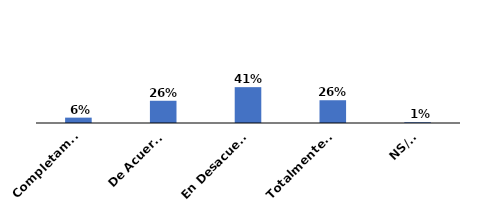
| Category | Series 0 |
|---|---|
| Completamente de acuerdo | 0.062 |
| De Acuerdo | 0.256 |
| En Desacuerdo | 0.412 |
| Totalmente en desacuerdo | 0.262 |
| NS/NR | 0.009 |